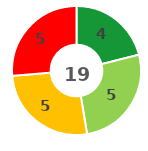
| Category | Series 0 |
|---|---|
| 0 | 4 |
| 1 | 5 |
| 2 | 5 |
| 3 | 5 |
| 4 | 0 |